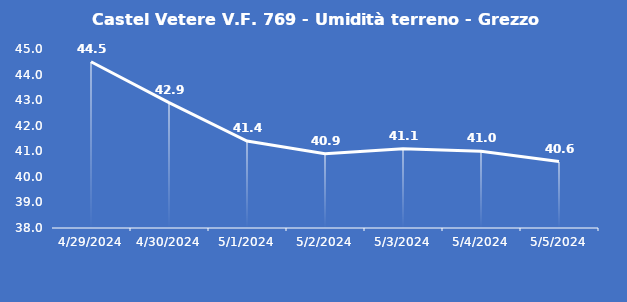
| Category | Castel Vetere V.F. 769 - Umidità terreno - Grezzo (%VWC) |
|---|---|
| 4/29/24 | 44.5 |
| 4/30/24 | 42.9 |
| 5/1/24 | 41.4 |
| 5/2/24 | 40.9 |
| 5/3/24 | 41.1 |
| 5/4/24 | 41 |
| 5/5/24 | 40.6 |